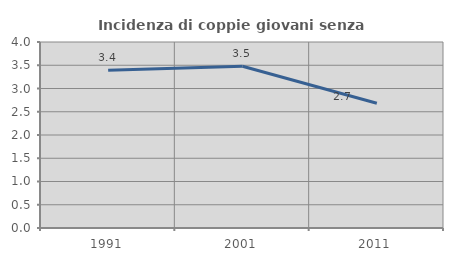
| Category | Incidenza di coppie giovani senza figli |
|---|---|
| 1991.0 | 3.39 |
| 2001.0 | 3.478 |
| 2011.0 | 2.683 |